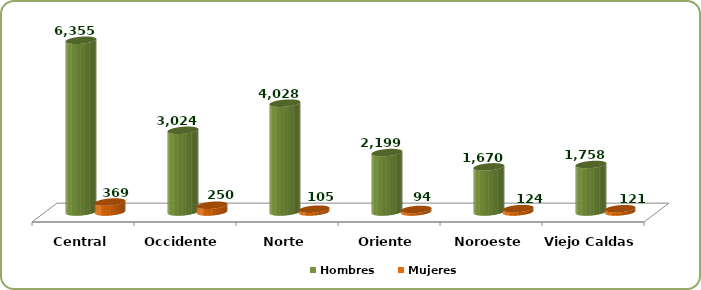
| Category | Hombres | Mujeres |
|---|---|---|
| Central | 6355 | 369 |
| Occidente | 3024 | 250 |
| Norte | 4028 | 105 |
| Oriente | 2199 | 94 |
| Noroeste | 1670 | 124 |
| Viejo Caldas | 1758 | 121 |